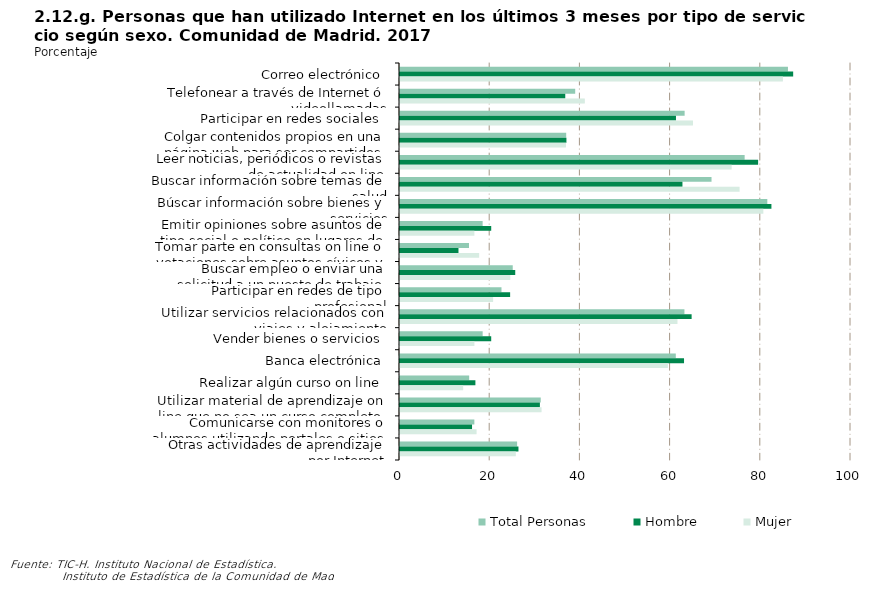
| Category | Total Personas | Hombre | Mujer |
|---|---|---|---|
| Correo electrónico | 86.021 | 87.179 | 84.904 |
| Telefonear a través de Internet ó videollamadas | 38.849 | 36.643 | 40.979 |
| Participar en redes sociales | 63.11 | 61.192 | 64.962 |
| Colgar contenidos propios en una página web para ser compartidos | 36.853 | 36.901 | 36.806 |
| Leer noticias, periódicos o revistas de actualidad on line | 76.418 | 79.404 | 73.536 |
| Buscar información sobre temas de salud | 69.075 | 62.627 | 75.3 |
| Búscar información sobre bienes y servicios | 81.445 | 82.355 | 80.566 |
| Emitir opiniones sobre asuntos de tipo social o político en lugares de la Red | 18.326 | 20.225 | 16.492 |
| Tomar parte en consultas on line o votaciones sobre asuntos cívicos y políticos | 15.3 | 12.967 | 17.553 |
| Buscar empleo o enviar una solicitud a un puesto de trabajo | 24.998 | 25.552 | 24.464 |
| Participar en redes de tipo profesional | 22.502 | 24.42 | 20.65 |
| Utilizar servicios relacionados con viajes y alojamiento | 63.065 | 64.661 | 61.523 |
| Vender bienes o servicios | 18.329 | 20.224 | 16.499 |
| Banca electrónica | 61.154 | 62.978 | 59.394 |
| Realizar algún curso on line | 15.341 | 16.719 | 14.011 |
| Utilizar material de aprendizaje on line que no sea un curso completo on line | 31.207 | 31.017 | 31.39 |
| Comunicarse con monitores o alumnos utilizando portales o sitios web educativos | 16.487 | 15.976 | 16.98 |
| Otras actividades de aprendizaje por Internet | 25.968 | 26.264 | 25.683 |